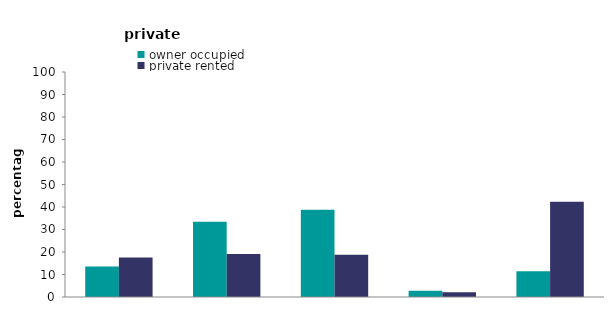
| Category | owner occupied | private rented |
|---|---|---|
| non-problematic | 13.523 | 17.558 |
| external features | 33.459 | 19.133 |
| predominant 
render 
 wall finish | 38.8 | 18.794 |
| predominant clad or 
stone
(non masonry) finish | 2.788 | 2.161 |
| flat | 11.431 | 42.354 |